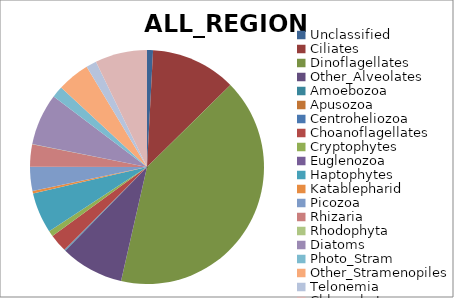
| Category | ALL_REGIONS |
|---|---|
| Unclassified | 0.008 |
| Ciliates | 0.118 |
| Dinoflagellates | 0.409 |
| Other_Alveolates | 0.087 |
| Amoebozoa | 0.001 |
| Apusozoa | 0 |
| Centroheliozoa | 0.001 |
| Choanoflagellates | 0.025 |
| Cryptophytes | 0.008 |
| Euglenozoa | 0 |
| Haptophytes | 0.056 |
| Katablepharid | 0.003 |
| Picozoa | 0.033 |
| Rhizaria | 0.031 |
| Rhodophyta | 0 |
| Diatoms | 0.072 |
| Photo_Stram | 0.016 |
| Other_Stramenopiles | 0.045 |
| Telonemia | 0.014 |
| Chlorophytes | 0.072 |